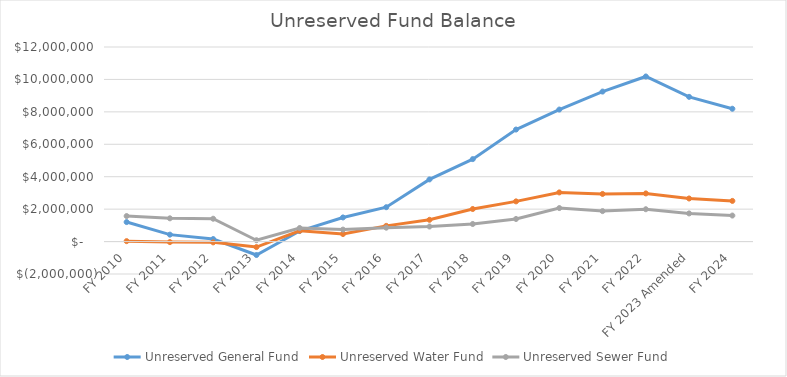
| Category | Unreserved General Fund | Unreserved Water Fund | Unreserved Sewer Fund |
|---|---|---|---|
| FY 2010 | 1203055 | 26222 | 1574025 |
| FY 2011 | 427316 | -32843 | 1433973 |
| FY 2012 | 155380 | -49213 | 1408433 |
| FY 2013 | -829445 | -338946 | 82889 |
| FY 2014 | 648890.18 | 665030 | 836692 |
| FY 2015 | 1487349 | 465849 | 737244 |
| FY 2016 | 2118701 | 968201 | 858060 |
| FY 2017 | 3833567 | 1341759 | 928261 |
| FY 2018 | 5085475 | 2008652 | 1083494 |
| FY 2019 | 6909336 | 2478796 | 1394063 |
| FY 2020 | 8141851 | 3031453 | 2066908 |
| FY 2021 | 9250420 | 2937353 | 1878009 |
| FY 2022 | 10182395 | 2969790 | 1994383 |
| FY 2023 Amended | 8924925 | 2657290 | 1735978 |
| FY 2024 | 8191802 | 2507290 | 1604978 |